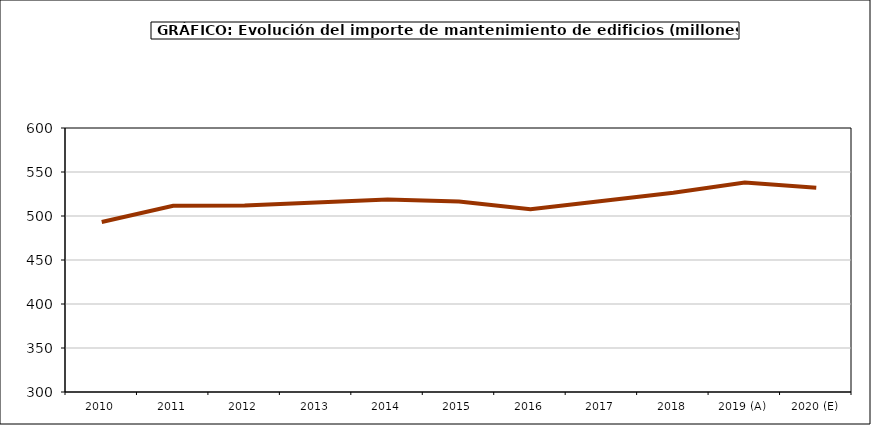
| Category | mantenimiento |
|---|---|
| 2010 | 493.233 |
| 2011 | 511.585 |
| 2012 | 512.04 |
| 2013 | 515.387 |
| 2014 | 518.885 |
| 2015 | 516.507 |
| 2016 | 507.665 |
| 2017 | 516.979 |
| 2018 | 526.443 |
| 2019 (A) | 537.976 |
| 2020 (E) | 532.082 |